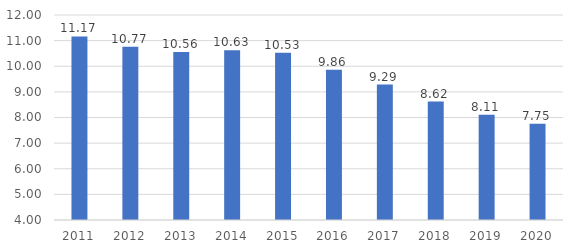
| Category | IPM |
|---|---|
| 2011.0 | 11.166 |
| 2012.0 | 10.765 |
| 2013.0 | 10.557 |
| 2014.0 | 10.627 |
| 2015.0 | 10.53 |
| 2016.0 | 9.86 |
| 2017.0 | 9.286 |
| 2018.0 | 8.624 |
| 2019.0 | 8.112 |
| 2020.0 | 7.754 |